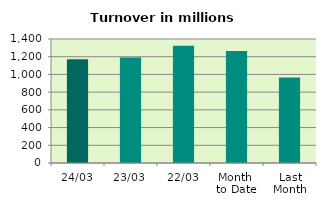
| Category | Series 0 |
|---|---|
| 24/03 | 1170.788 |
| 23/03 | 1190.361 |
| 22/03 | 1324.706 |
| Month 
to Date | 1264.747 |
| Last
Month | 966.674 |